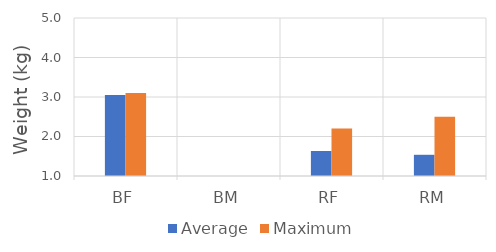
| Category | Average | Maximum |
|---|---|---|
| BF | 3.05 | 3.1 |
| BM | 0 | 0 |
| RF | 1.633 | 2.2 |
| RM | 1.537 | 2.5 |